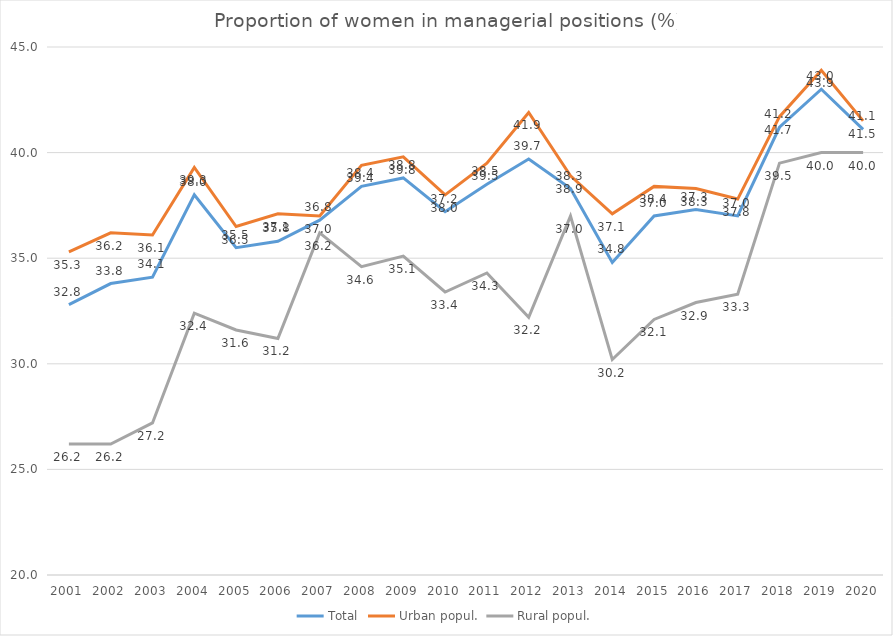
| Category | Total | Urban popul. | Rural popul. |
|---|---|---|---|
| 2001.0 | 32.8 | 35.3 | 26.2 |
| 2002.0 | 33.8 | 36.2 | 26.2 |
| 2003.0 | 34.1 | 36.1 | 27.2 |
| 2004.0 | 38 | 39.3 | 32.4 |
| 2005.0 | 35.5 | 36.5 | 31.6 |
| 2006.0 | 35.8 | 37.1 | 31.2 |
| 2007.0 | 36.8 | 37 | 36.2 |
| 2008.0 | 38.4 | 39.4 | 34.6 |
| 2009.0 | 38.8 | 39.8 | 35.1 |
| 2010.0 | 37.2 | 38 | 33.4 |
| 2011.0 | 38.5 | 39.5 | 34.3 |
| 2012.0 | 39.7 | 41.9 | 32.2 |
| 2013.0 | 38.3 | 38.9 | 37 |
| 2014.0 | 34.8 | 37.1 | 30.2 |
| 2015.0 | 37 | 38.4 | 32.1 |
| 2016.0 | 37.3 | 38.3 | 32.9 |
| 2017.0 | 37 | 37.8 | 33.3 |
| 2018.0 | 41.2 | 41.7 | 39.5 |
| 2019.0 | 43 | 43.9 | 40 |
| 2020.0 | 41.1 | 41.5 | 40 |